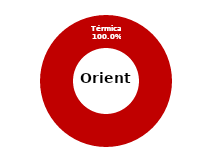
| Category | Oriente |
|---|---|
| Eólica | 0 |
| Hidráulica | 0 |
| Solar | 0 |
| Térmica | 34.752 |